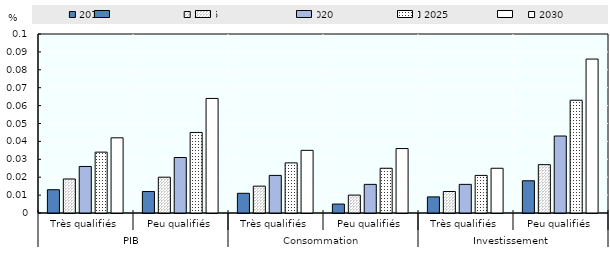
| Category | 2010 | 2015 | 2020 | 2025 | 2030 |
|---|---|---|---|---|---|
| 0 | 0.013 | 0.019 | 0.026 | 0.034 | 0.042 |
| 1 | 0.012 | 0.02 | 0.031 | 0.045 | 0.064 |
| 2 | 0.011 | 0.015 | 0.021 | 0.028 | 0.035 |
| 3 | 0.005 | 0.01 | 0.016 | 0.025 | 0.036 |
| 4 | 0.009 | 0.012 | 0.016 | 0.021 | 0.025 |
| 5 | 0.018 | 0.027 | 0.043 | 0.063 | 0.086 |